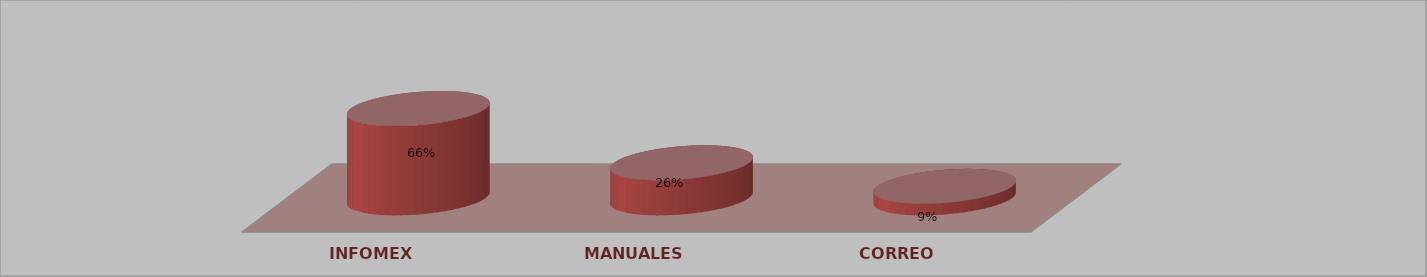
| Category | Series 0 | Series 1 |
|---|---|---|
| INFOMEX | 323 | 0.655 |
| MANUALES | 127 | 0.258 |
| CORREO | 42 | 0.085 |